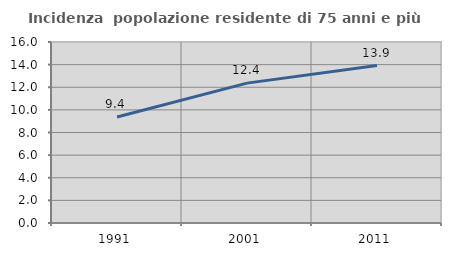
| Category | Incidenza  popolazione residente di 75 anni e più |
|---|---|
| 1991.0 | 9.371 |
| 2001.0 | 12.365 |
| 2011.0 | 13.918 |